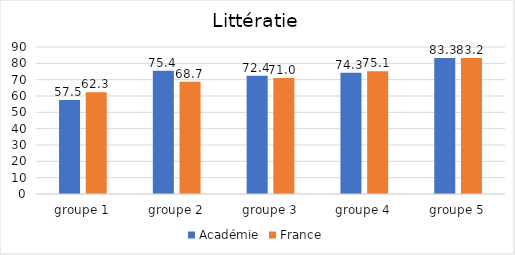
| Category | Académie | France |
|---|---|---|
| groupe 1 | 57.5 | 62.3 |
| groupe 2 | 75.4 | 68.7 |
| groupe 3 | 72.4 | 71 |
| groupe 4 | 74.3 | 75.1 |
| groupe 5 | 83.3 | 83.2 |